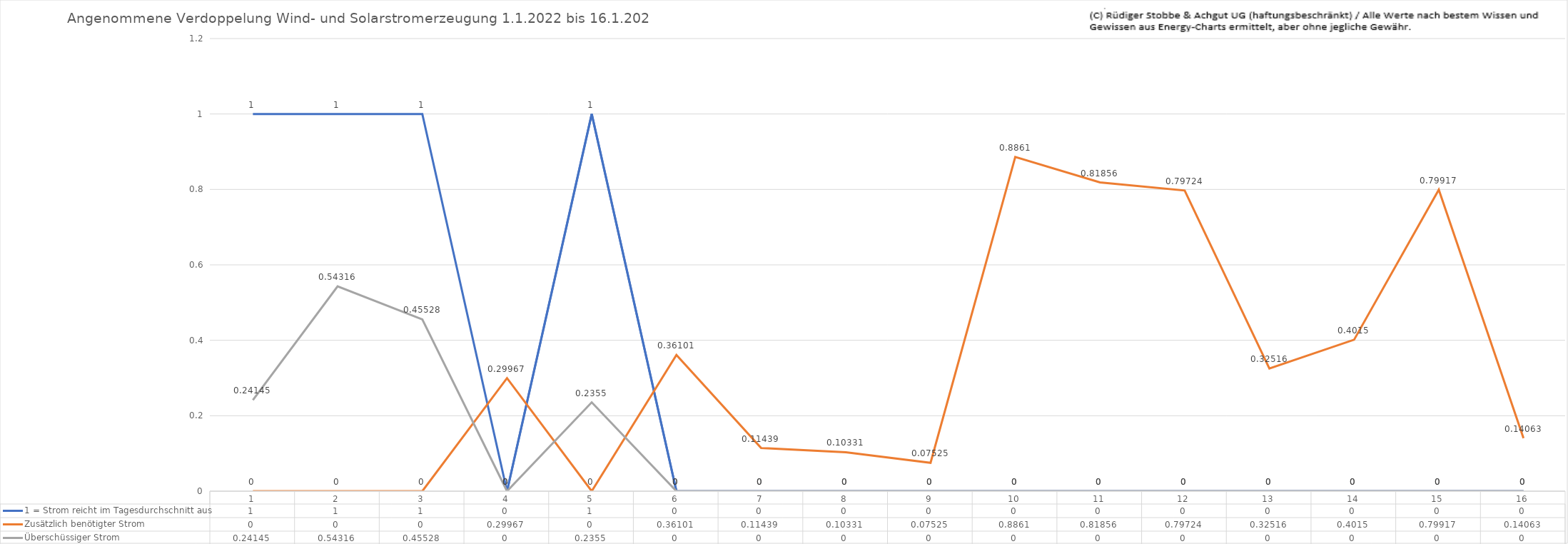
| Category | 1 = Strom reicht im Tagesdurchschnitt aus | Zusätzlich benötigter Strom | Überschüssiger Strom |
|---|---|---|---|
| 0 | 1 | 0 | 0.241 |
| 1 | 1 | 0 | 0.543 |
| 2 | 1 | 0 | 0.455 |
| 3 | 0 | 0.3 | 0 |
| 4 | 1 | 0 | 0.236 |
| 5 | 0 | 0.361 | 0 |
| 6 | 0 | 0.114 | 0 |
| 7 | 0 | 0.103 | 0 |
| 8 | 0 | 0.075 | 0 |
| 9 | 0 | 0.886 | 0 |
| 10 | 0 | 0.819 | 0 |
| 11 | 0 | 0.797 | 0 |
| 12 | 0 | 0.325 | 0 |
| 13 | 0 | 0.402 | 0 |
| 14 | 0 | 0.799 | 0 |
| 15 | 0 | 0.141 | 0 |